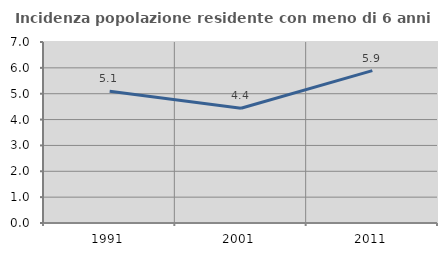
| Category | Incidenza popolazione residente con meno di 6 anni |
|---|---|
| 1991.0 | 5.097 |
| 2001.0 | 4.44 |
| 2011.0 | 5.892 |